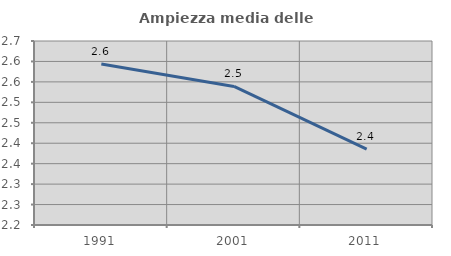
| Category | Ampiezza media delle famiglie |
|---|---|
| 1991.0 | 2.594 |
| 2001.0 | 2.539 |
| 2011.0 | 2.385 |